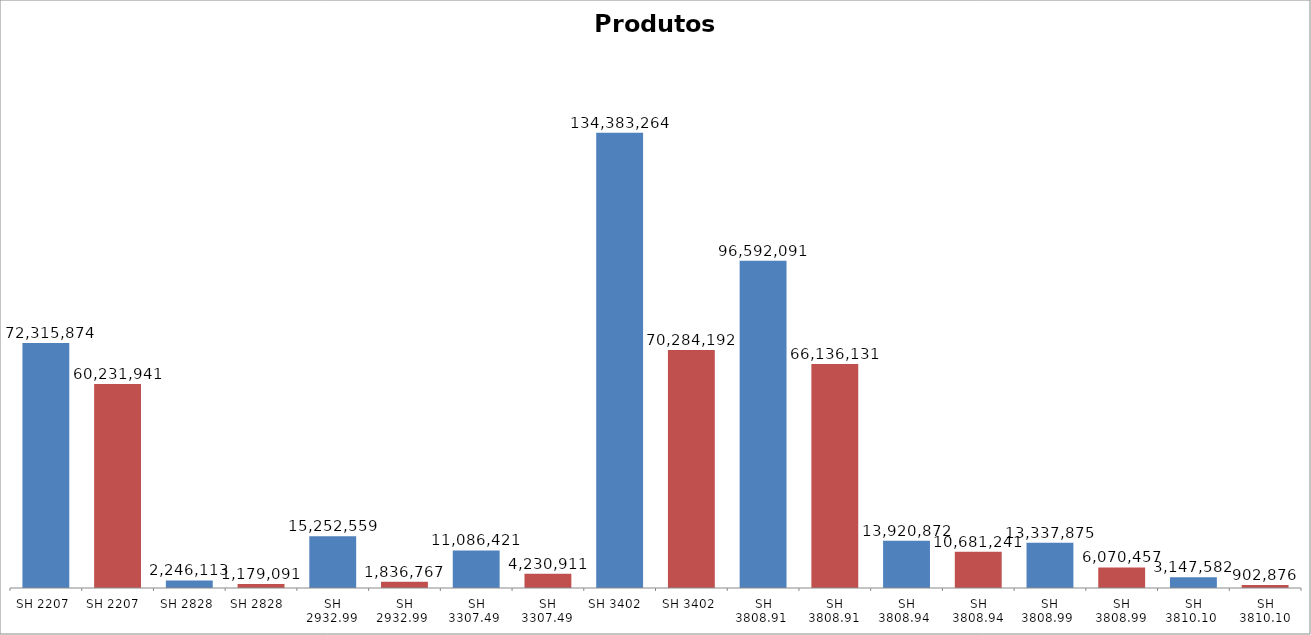
| Category | Total |
|---|---|
| SH 2207  | 72315874.01 |
| SH 2207   | 60231941.21 |
| SH 2828  | 2246113.14 |
| SH 2828   | 1179091.27 |
| SH 2932.99  | 15252559.42 |
| SH 2932.99   | 1836767.22 |
| SH 3307.49   | 11086421.03 |
| SH 3307.49  | 4230911.41 |
| SH 3402   | 134383263.64 |
| SH 3402  | 70284192.38 |
| SH 3808.91   | 96592091.12 |
| SH 3808.91  | 66136130.82 |
| SH 3808.94   | 13920872.11 |
| SH 3808.94  | 10681240.63 |
| SH 3808.99   | 13337875.11 |
| SH 3808.99  | 6070457.46 |
| SH 3810.10   | 3147582.1 |
| SH 3810.10  | 902875.88 |